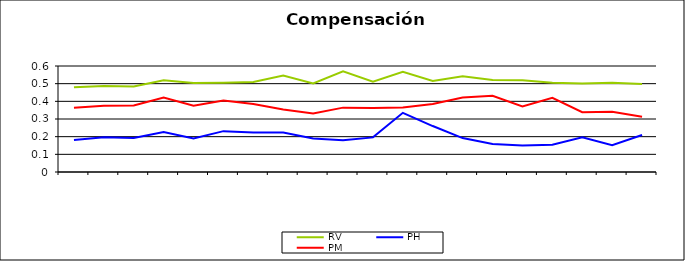
| Category | RV | PH | PM |
|---|---|---|---|
| 0 | 0.479 | 0.181 | 0.364 |
| 1 | 0.487 | 0.196 | 0.375 |
| 2 | 0.484 | 0.192 | 0.376 |
| 3 | 0.52 | 0.226 | 0.421 |
| 4 | 0.504 | 0.189 | 0.375 |
| 5 | 0.506 | 0.231 | 0.404 |
| 6 | 0.51 | 0.224 | 0.384 |
| 7 | 0.546 | 0.223 | 0.353 |
| 8 | 0.501 | 0.19 | 0.331 |
| 9 | 0.57 | 0.18 | 0.364 |
| 10 | 0.511 | 0.196 | 0.363 |
| 11 | 0.567 | 0.335 | 0.365 |
| 12 | 0.515 | 0.26 | 0.385 |
| 13 | 0.543 | 0.192 | 0.422 |
| 14 | 0.52 | 0.158 | 0.431 |
| 15 | 0.519 | 0.15 | 0.371 |
| 16 | 0.505 | 0.154 | 0.42 |
| 17 | 0.501 | 0.196 | 0.339 |
| 18 | 0.506 | 0.151 | 0.341 |
| 19 | 0.498 | 0.209 | 0.313 |